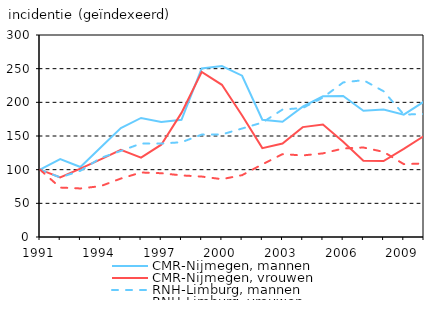
| Category | CMR-Nijmegen, mannen | CMR-Nijmegen, vrouwen | RNH-Limburg, mannen | RNH-Limburg, vrouwen |
|---|---|---|---|---|
| 1991.0 | 100 | 100 | 100 | 100 |
| 1992.0 | 115.818 | 88.447 | 88.49 | 73.413 |
| 1993.0 | 103.985 | 101.626 | 98.36 | 72.095 |
| 1994.0 | 133.036 | 115.3 | 117.338 | 75.534 |
| 1995.0 | 161.772 | 129.324 | 127.848 | 86.793 |
| 1996.0 | 176.78 | 117.973 | 138.787 | 95.788 |
| 1997.0 | 170.649 | 137.093 | 138.813 | 94.737 |
| 1998.0 | 174.132 | 184.301 | 140.72 | 91.489 |
| 1999.0 | 250.421 | 245.038 | 152.044 | 89.768 |
| 2000.0 | 253.963 | 226.006 | 152.338 | 85.872 |
| 2001.0 | 239.524 | 180.454 | 161.134 | 91.837 |
| 2002.0 | 174.116 | 131.972 | 169.972 | 107.926 |
| 2003.0 | 171.245 | 138.837 | 189.319 | 123.04 |
| 2004.0 | 193.675 | 163.187 | 191.563 | 121.135 |
| 2005.0 | 208.966 | 166.997 | 207.097 | 124.188 |
| 2006.0 | 209.479 | 141.401 | 229.557 | 131.483 |
| 2007.0 | 187.553 | 113.406 | 232.923 | 132.923 |
| 2008.0 | 189.449 | 112.723 | 216.449 | 126.421 |
| 2009.0 | 181.635 | 130.855 | 181.835 | 108.223 |
| 2010.0 | 200.991 | 150.099 | 182.637 | 109.211 |